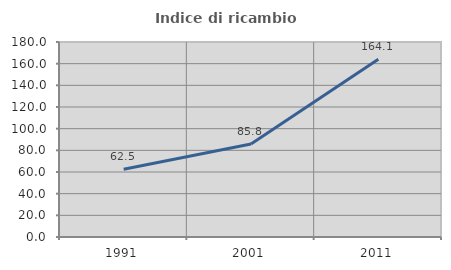
| Category | Indice di ricambio occupazionale  |
|---|---|
| 1991.0 | 62.5 |
| 2001.0 | 85.827 |
| 2011.0 | 164.085 |